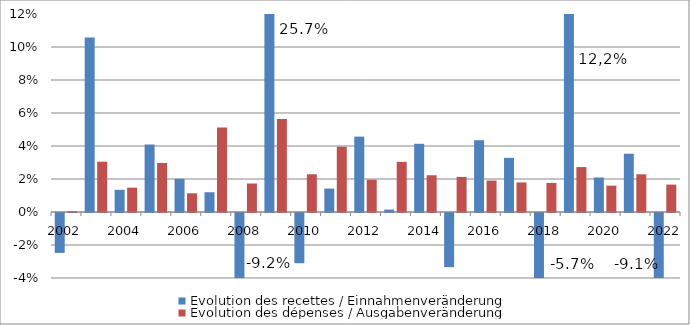
| Category | Evolution des recettes / Einnahmenveränderung | Evolution des dépenses / Ausgabenveränderung |
|---|---|---|
| 2002 | -0.024 | 0 |
| 2003* | 0.106 | 0.03 |
| 2004 | 0.013 | 0.015 |
| 2005* | 0.041 | 0.03 |
| 2006 | 0.02 | 0.011 |
| 2007* | 0.012 | 0.051 |
| 2008 | -0.092 | 0.017 |
| 2009* | 0.257 | 0.056 |
| 2010 | -0.03 | 0.023 |
| 2011* | 0.014 | 0.04 |
| 2012 | 0.046 | 0.02 |
| 2013 | 0.001 | 0.03 |
| 2014 | 0.041 | 0.022 |
| 2015* | -0.033 | 0.021 |
| 2016 | 0.044 | 0.019 |
| 2017 | 0.033 | 0.018 |
| 2018 | -0.057 | 0.018 |
| 2019 | 0.122 | 0.027 |
| 2020 | 0.021 | 0.016 |
| 2021 | 0.035 | 0.023 |
| 2022 | -0.091 | 0.017 |